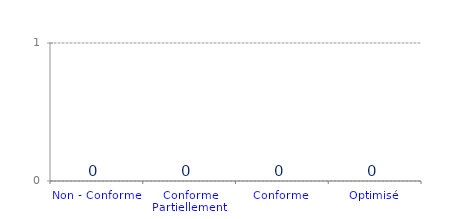
| Category | Véracité |
|---|---|
| Non - Conforme | 0 |
| Conforme Partiellement  | 0 |
| Conforme | 0 |
| Optimisé | 0 |